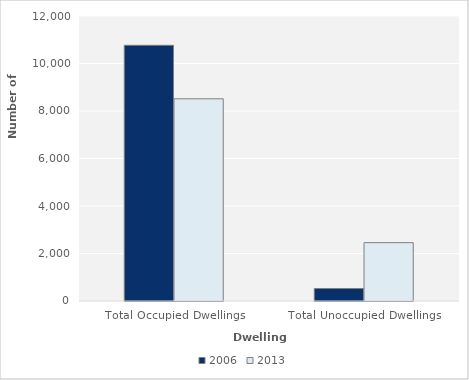
| Category | 2006 | 2013 |
|---|---|---|
| Total Occupied Dwellings | 10767 | 8514 |
| Total Unoccupied Dwellings | 525 | 2457 |